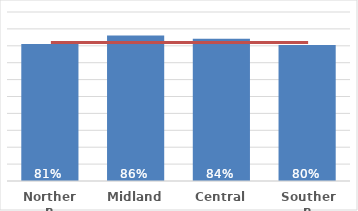
| Category | Pacific |
|---|---|
| Northern | 0.811 |
| Midland | 0.861 |
| Central | 0.841 |
| Southern | 0.805 |